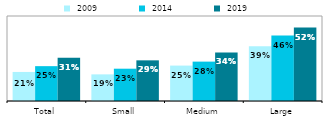
| Category |  2009 |  2014 |  2019 |
|---|---|---|---|
| Total | 0.205 | 0.246 | 0.306 |
| Small | 0.188 | 0.228 | 0.287 |
| Medium | 0.25 | 0.278 | 0.343 |
| Large | 0.387 | 0.462 | 0.518 |